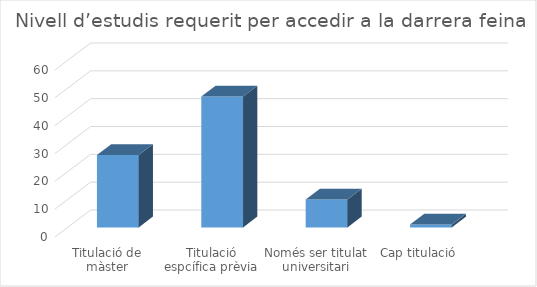
| Category | Series 0 |
|---|---|
| Titulació de màster | 26 |
| Titulació espcífica prèvia | 47 |
| Només ser titulat universitari | 10 |
| Cap titulació | 1 |